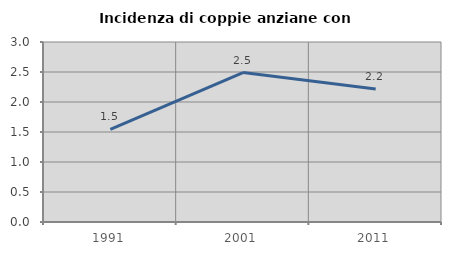
| Category | Incidenza di coppie anziane con figli |
|---|---|
| 1991.0 | 1.544 |
| 2001.0 | 2.492 |
| 2011.0 | 2.218 |